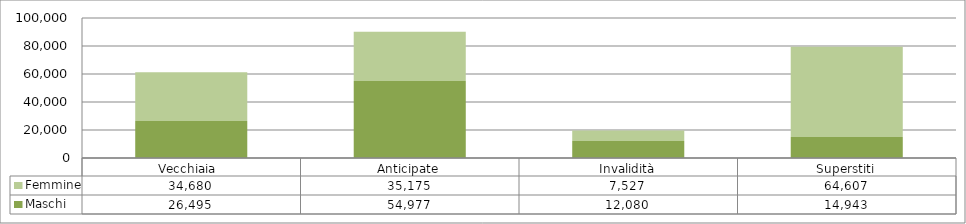
| Category | Maschi | Femmine |
|---|---|---|
| Vecchiaia  | 26495 | 34680 |
| Anticipate | 54977 | 35175 |
| Invalidità | 12080 | 7527 |
| Superstiti | 14943 | 64607 |